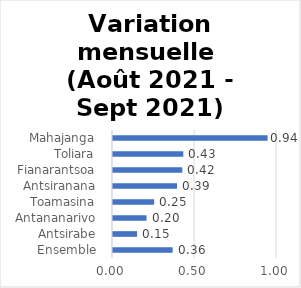
| Category | Variation mensuelle |
|---|---|
|  Ensemble  | 0.364 |
|  Antsirabe  | 0.147 |
|  Antananarivo  | 0.204 |
|  Toamasina  | 0.251 |
|  Antsiranana  | 0.39 |
|  Fianarantsoa  | 0.423 |
|  Toliara  | 0.429 |
|  Mahajanga  | 0.943 |